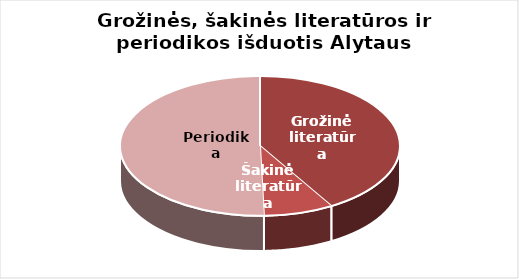
| Category | Series 0 |
|---|---|
| Grožinė literatūra | 506488 |
| Šakinė literatūra | 98244 |
| Periodika | 615632 |